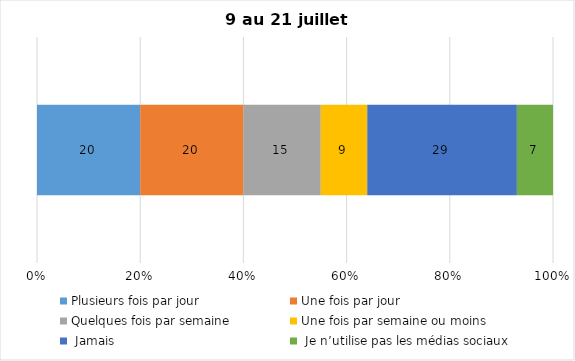
| Category | Plusieurs fois par jour | Une fois par jour | Quelques fois par semaine   | Une fois par semaine ou moins   |  Jamais   |  Je n’utilise pas les médias sociaux |
|---|---|---|---|---|---|---|
| 0 | 20 | 20 | 15 | 9 | 29 | 7 |